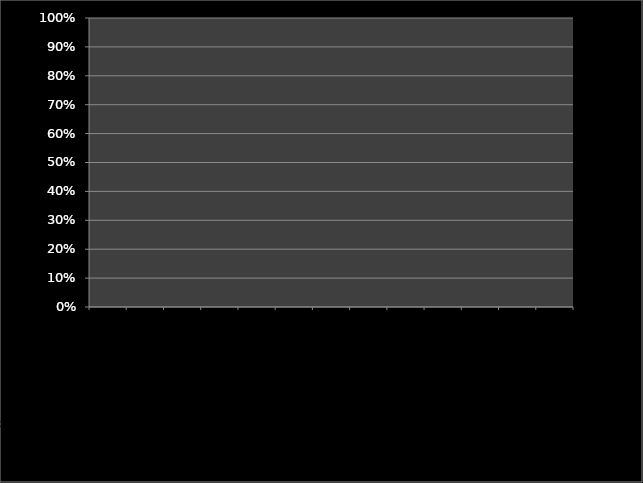
| Category | Series 0 |
|---|---|
| 1-MALZEME KABUL ve GİRİŞ KONTROL | 0 |
| 2-DEPOLAMA  | 0 |
| 3-ÜRETİM ALANLARI  | 0 |
| 4-GENEL TEMİZLİK VE SANİTASYON | 0 |
| 5-HAŞERE KONTROL VE MÜCADELE | 0 |
| 6-ÇÖP VE ATIK YÖNETİMİ | 0 |
| 7-BULAŞIK BÖLÜMÜ | 0 |
| 8-PERSONEL | 0 |
| 9-SERVİS BÖLGESİ | 0 |
| 10-İÇME SULARI | 0 |
| 11-NUMUNE KONTROL | 0 |
| 12-MÖNÜ | 0 |
| 13-KALİTE YÖNETİM SİSTEMİ | 0 |